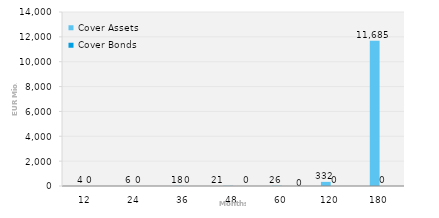
| Category | Cover Assets | Cover Bonds |
|---|---|---|
| 12.0 | 3.93 | 0 |
| 24.0 | 6.084 | 0 |
| 36.0 | 17.989 | 0 |
| 48.0 | 20.978 | 0 |
| 60.0 | 26.332 | 0 |
| 120.0 | 332.124 | 0 |
| 180.0 | 11685.412 | 0 |